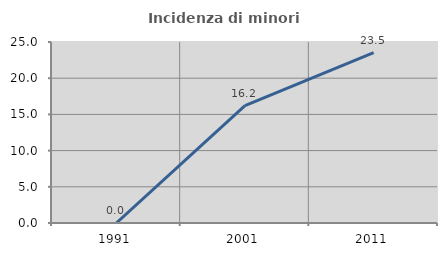
| Category | Incidenza di minori stranieri |
|---|---|
| 1991.0 | 0 |
| 2001.0 | 16.216 |
| 2011.0 | 23.529 |